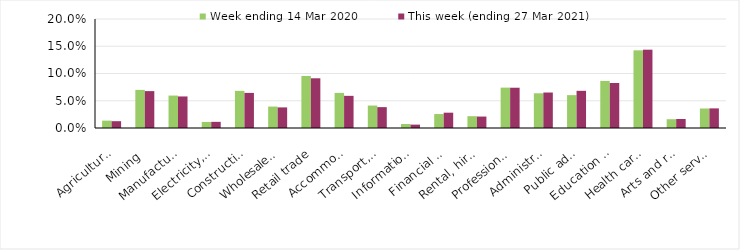
| Category | Week ending 14 Mar 2020 | This week (ending 27 Mar 2021) |
|---|---|---|
| Agriculture, forestry and fishing | 0.014 | 0.012 |
| Mining | 0.07 | 0.068 |
| Manufacturing | 0.06 | 0.058 |
| Electricity, gas, water and waste services | 0.011 | 0.011 |
| Construction | 0.068 | 0.064 |
| Wholesale trade | 0.039 | 0.038 |
| Retail trade | 0.095 | 0.091 |
| Accommodation and food services | 0.064 | 0.059 |
| Transport, postal and warehousing | 0.041 | 0.038 |
| Information media and telecommunications | 0.007 | 0.006 |
| Financial and insurance services | 0.026 | 0.028 |
| Rental, hiring and real estate services | 0.022 | 0.021 |
| Professional, scientific and technical services | 0.074 | 0.074 |
| Administrative and support services | 0.064 | 0.065 |
| Public administration and safety | 0.06 | 0.068 |
| Education and training | 0.086 | 0.083 |
| Health care and social assistance | 0.142 | 0.144 |
| Arts and recreation services | 0.016 | 0.016 |
| Other services | 0.036 | 0.036 |